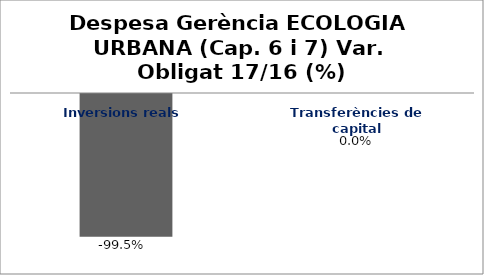
| Category | Series 0 |
|---|---|
| Inversions reals | -0.995 |
| Transferències de capital | 0 |